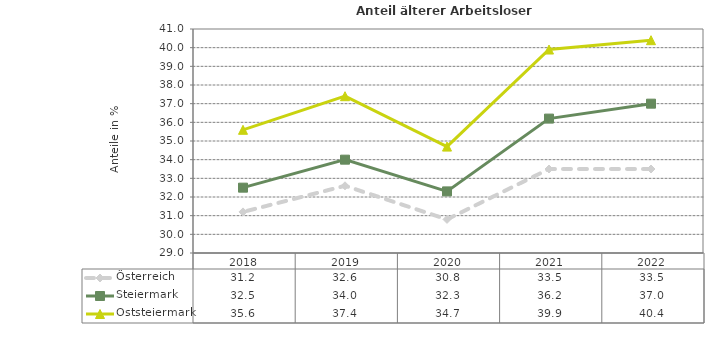
| Category | Österreich | Steiermark | Oststeiermark |
|---|---|---|---|
| 2022.0 | 33.5 | 37 | 40.4 |
| 2021.0 | 33.5 | 36.2 | 39.9 |
| 2020.0 | 30.8 | 32.3 | 34.7 |
| 2019.0 | 32.6 | 34 | 37.4 |
| 2018.0 | 31.2 | 32.5 | 35.6 |